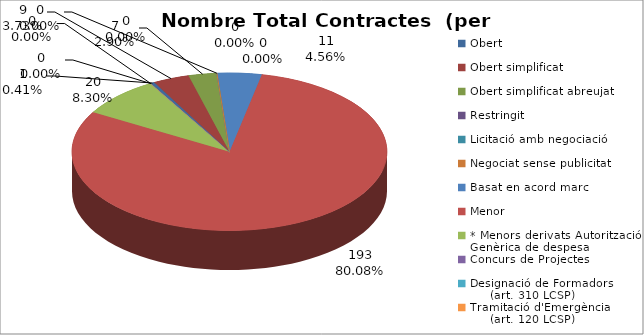
| Category | Nombre Total Contractes |
|---|---|
| Obert | 1 |
| Obert simplificat | 9 |
| Obert simplificat abreujat | 7 |
| Restringit | 0 |
| Licitació amb negociació | 0 |
| Negociat sense publicitat | 0 |
| Basat en acord marc | 11 |
| Menor | 193 |
| * Menors derivats Autorització Genèrica de despesa | 20 |
| Concurs de Projectes | 0 |
| Designació de Formadors
     (art. 310 LCSP) | 0 |
| Tramitació d'Emergència
     (art. 120 LCSP) | 0 |